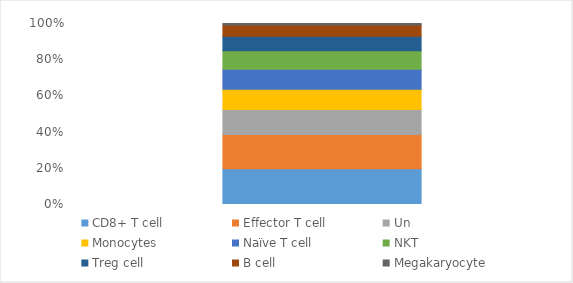
| Category | CD8+ T cell | Effector T cell | Un | Monocytes | Naïve T cell | NKT | Treg cell | B cell | Megakaryocyte |
|---|---|---|---|---|---|---|---|---|---|
| 0 | 1909 | 1828 | 1334 | 1075 | 1068 | 983 | 769 | 608 | 78 |